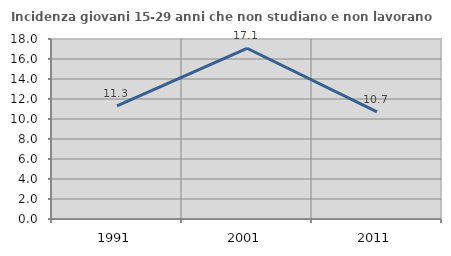
| Category | Incidenza giovani 15-29 anni che non studiano e non lavorano  |
|---|---|
| 1991.0 | 11.321 |
| 2001.0 | 17.073 |
| 2011.0 | 10.714 |